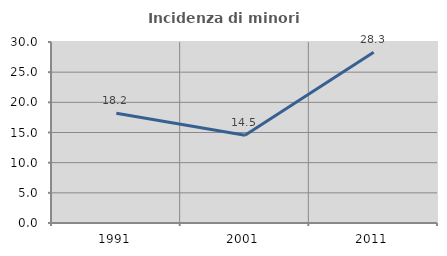
| Category | Incidenza di minori stranieri |
|---|---|
| 1991.0 | 18.182 |
| 2001.0 | 14.545 |
| 2011.0 | 28.283 |